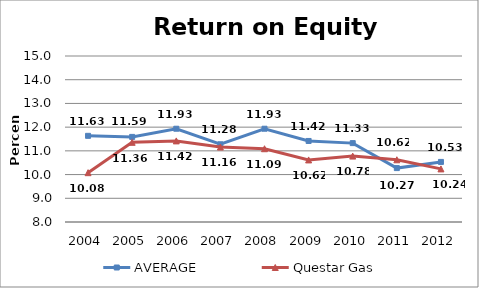
| Category | AVERAGE  | Questar Gas |
|---|---|---|
| 2004.0 | 11.633 | 10.08 |
| 2005.0 | 11.589 | 11.36 |
| 2006.0 | 11.933 | 11.42 |
| 2007.0 | 11.278 | 11.16 |
| 2008.0 | 11.933 | 11.09 |
| 2009.0 | 11.417 | 10.618 |
| 2010.0 | 11.326 | 10.78 |
| 2011.0 | 10.273 | 10.623 |
| 2012.0 | 10.534 | 10.239 |